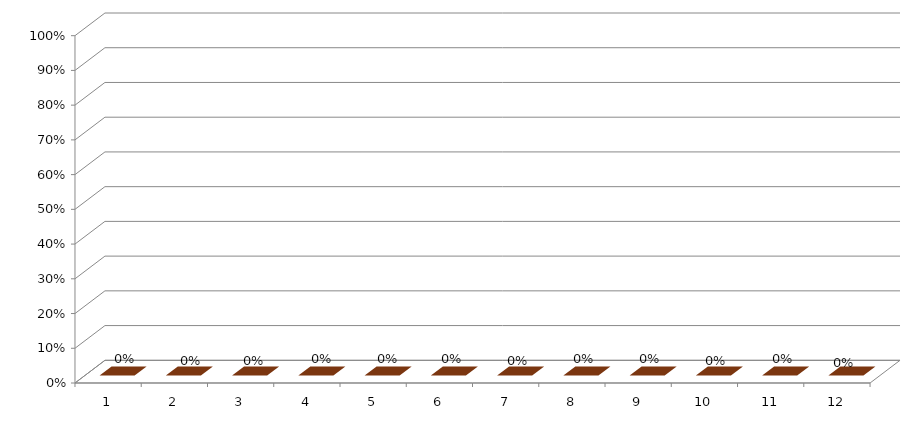
| Category | Series 3 |
|---|---|
| 1.0 | 0 |
| 2.0 | 0 |
| 3.0 | 0 |
| 4.0 | 0 |
| 5.0 | 0 |
| 6.0 | 0 |
| 7.0 | 0 |
| 8.0 | 0 |
| 9.0 | 0 |
| 10.0 | 0 |
| 11.0 | 0 |
| 12.0 | 0 |